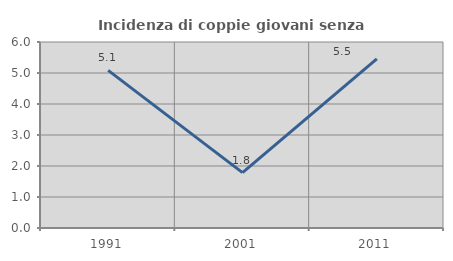
| Category | Incidenza di coppie giovani senza figli |
|---|---|
| 1991.0 | 5.085 |
| 2001.0 | 1.786 |
| 2011.0 | 5.455 |